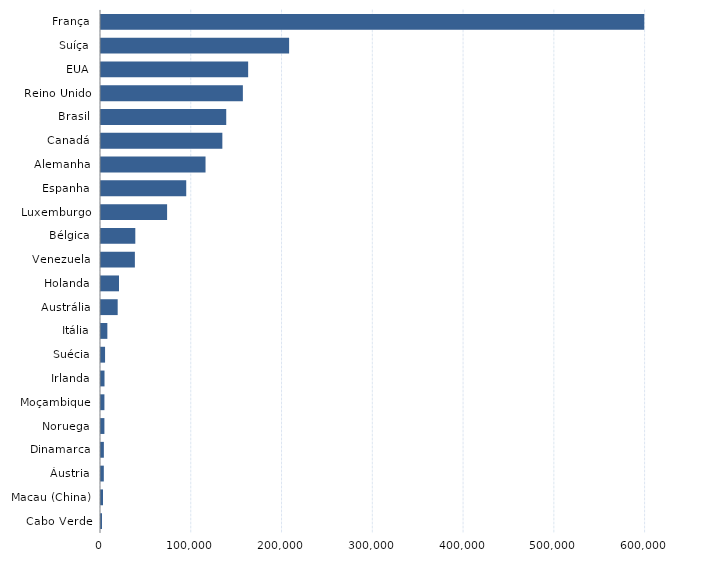
| Category | Series 0 |
|---|---|
| Cabo Verde | 1090 |
| Macau (China) | 2213 |
| Áustria | 3105 |
| Dinamarca | 3156 |
| Noruega | 3752 |
| Moçambique | 3767 |
| Irlanda | 3866 |
| Suécia | 4478 |
| Itália | 7000 |
| Austrália | 18380 |
| Holanda | 19816 |
| Venezuela | 37326 |
| Bélgica | 37798 |
| Luxemburgo | 72821 |
| Espanha | 93902 |
| Alemanha | 115165 |
| Canadá | 133695 |
| Brasil | 137973 |
| Reino Unido | 156295 |
| EUA | 162121 |
| Suíça | 207251 |
| França | 598500 |